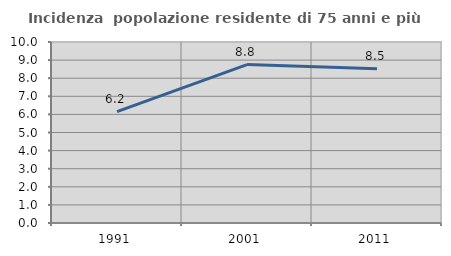
| Category | Incidenza  popolazione residente di 75 anni e più |
|---|---|
| 1991.0 | 6.155 |
| 2001.0 | 8.752 |
| 2011.0 | 8.524 |